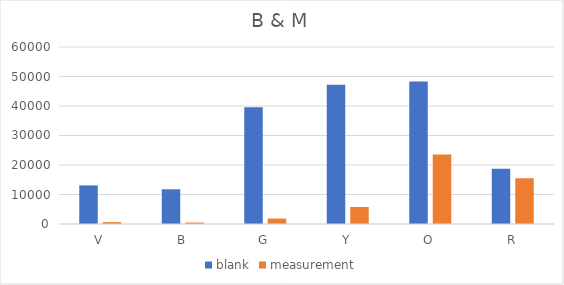
| Category | blank | measurement |
|---|---|---|
| V | 13081 | 636 |
| B | 11772 | 501 |
| G | 39538 | 1836 |
| Y | 47198 | 5758 |
| O | 48323 | 23557 |
| R | 18744 | 15510 |